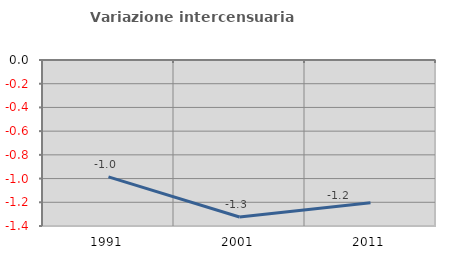
| Category | Variazione intercensuaria annua |
|---|---|
| 1991.0 | -0.985 |
| 2001.0 | -1.324 |
| 2011.0 | -1.203 |